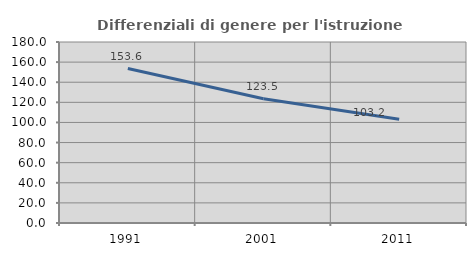
| Category | Differenziali di genere per l'istruzione superiore |
|---|---|
| 1991.0 | 153.635 |
| 2001.0 | 123.543 |
| 2011.0 | 103.195 |